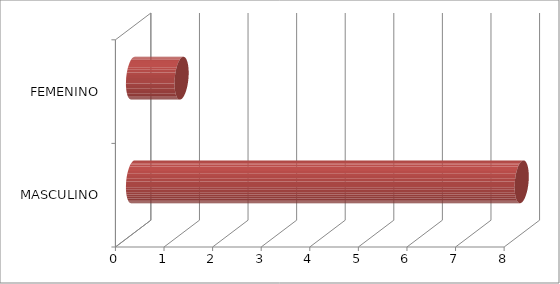
| Category | Series 0 |
|---|---|
| MASCULINO | 8 |
| FEMENINO | 1 |